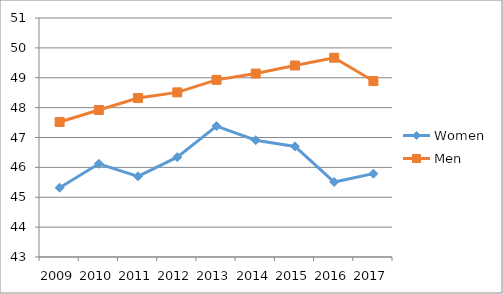
| Category | Women | Men |
|---|---|---|
| 2009.0 | 45.32 | 47.52 |
| 2010.0 | 46.12 | 47.92 |
| 2011.0 | 45.7 | 48.32 |
| 2012.0 | 46.34 | 48.51 |
| 2013.0 | 47.38 | 48.93 |
| 2014.0 | 46.91 | 49.14 |
| 2015.0 | 46.7 | 49.41 |
| 2016.0 | 45.51 | 49.67 |
| 2017.0 | 45.79 | 48.89 |